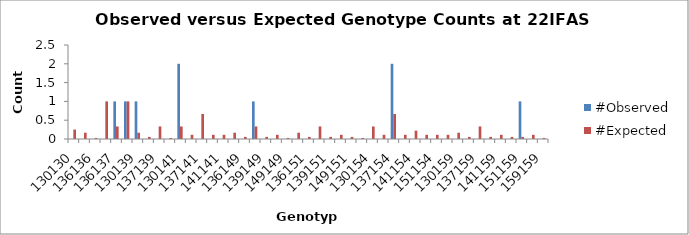
| Category | #Observed | #Expected |
|---|---|---|
| 130130.0 | 0 | 0.25 |
| 130136.0 | 0 | 0.167 |
| 136136.0 | 0 | 0.028 |
| 130137.0 | 0 | 1 |
| 136137.0 | 1 | 0.333 |
| 137137.0 | 1 | 1 |
| 130139.0 | 1 | 0.167 |
| 136139.0 | 0 | 0.056 |
| 137139.0 | 0 | 0.333 |
| 139139.0 | 0 | 0.028 |
| 130141.0 | 2 | 0.333 |
| 136141.0 | 0 | 0.111 |
| 137141.0 | 0 | 0.667 |
| 139141.0 | 0 | 0.111 |
| 141141.0 | 0 | 0.111 |
| 130149.0 | 0 | 0.167 |
| 136149.0 | 0 | 0.056 |
| 137149.0 | 1 | 0.333 |
| 139149.0 | 0 | 0.056 |
| 141149.0 | 0 | 0.111 |
| 149149.0 | 0 | 0.028 |
| 130151.0 | 0 | 0.167 |
| 136151.0 | 0 | 0.056 |
| 137151.0 | 0 | 0.333 |
| 139151.0 | 0 | 0.056 |
| 141151.0 | 0 | 0.111 |
| 149151.0 | 0 | 0.056 |
| 151151.0 | 0 | 0.028 |
| 130154.0 | 0 | 0.333 |
| 136154.0 | 0 | 0.111 |
| 137154.0 | 2 | 0.667 |
| 139154.0 | 0 | 0.111 |
| 141154.0 | 0 | 0.222 |
| 149154.0 | 0 | 0.111 |
| 151154.0 | 0 | 0.111 |
| 154154.0 | 0 | 0.111 |
| 130159.0 | 0 | 0.167 |
| 136159.0 | 0 | 0.056 |
| 137159.0 | 0 | 0.333 |
| 139159.0 | 0 | 0.056 |
| 141159.0 | 0 | 0.111 |
| 149159.0 | 0 | 0.056 |
| 151159.0 | 1 | 0.056 |
| 154159.0 | 0 | 0.111 |
| 159159.0 | 0 | 0.028 |